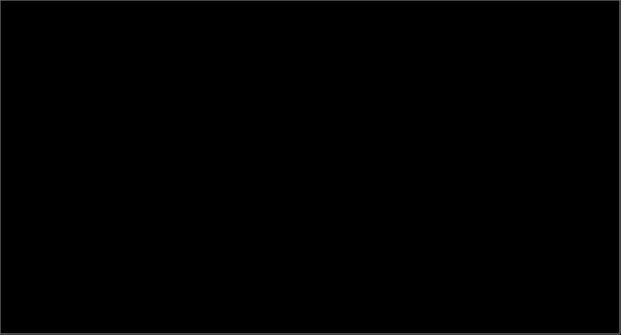
| Category | Frosh | Soph | Junior | Senior | Grad | Total Majors | Degrees |
|---|---|---|---|---|---|---|---|
| 2005 | 70 | 62 | 84 | 122 | 71 | 422 | 93 |
| 2006 | 62 | 69 | 79 | 128 | 81 | 436 | 86 |
| 2007 | 46 | 60 | 78 | 117 | 86 | 402 | 96 |
| 2008 | 52 | 48 | 85 | 104 | 76 | 381 | 90 |
| 2009 | 47 | 52 | 77 | 95 | 72 | 362 | 0 |